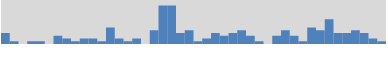
| Category | 4 |
|---|---|
| 39124.43278935185 | 4 |
| 39163.57579618863 | 1 |
| 39202.718803025404 | 0 |
| 39241.86180986218 | 1 |
| 39281.00481669896 | 1 |
| 39320.147823535735 | 0 |
| 39359.29083037251 | 3 |
| 39398.43383720929 | 2 |
| 39437.57684404607 | 1 |
| 39476.719850882844 | 2 |
| 39515.86285771962 | 2 |
| 39555.0058645564 | 1 |
| 39594.148871393176 | 6 |
| 39633.29187822995 | 2 |
| 39672.43488506673 | 1 |
| 39711.57789190351 | 2 |
| 39750.720898740285 | 0 |
| 39789.86390557706 | 5 |
| 39829.00691241384 | 14 |
| 39868.149919250616 | 14 |
| 39907.29292608739 | 4 |
| 39946.43593292417 | 5 |
| 39985.57893976095 | 1 |
| 40024.721946597725 | 2 |
| 40063.8649534345 | 4 |
| 40103.00796027128 | 3 |
| 40142.15096710806 | 4 |
| 40181.293973944834 | 5 |
| 40220.43698078161 | 3 |
| 40259.57998761839 | 1 |
| 40298.722994455165 | 0 |
| 40337.86600129194 | 3 |
| 40377.00900812872 | 5 |
| 40416.1520149655 | 3 |
| 40455.295021802274 | 1 |
| 40494.43802863905 | 6 |
| 40533.58103547583 | 5 |
| 40572.724042312606 | 9 |
| 40611.86704914938 | 4 |
| 40651.01005598616 | 4 |
| 40690.15306282294 | 5 |
| 40729.296069659715 | 4 |
| 40768.43907649649 | 2 |
| 40807.582083333335 | 1 |